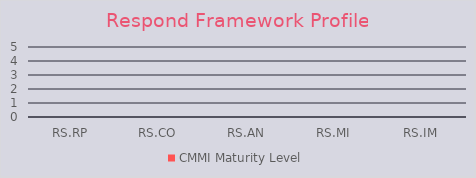
| Category | CMMI Maturity Level |
|---|---|
| RS.RP | 0 |
| RS.CO | 0 |
| RS.AN | 0 |
| RS.MI | 0 |
| RS.IM | 0 |